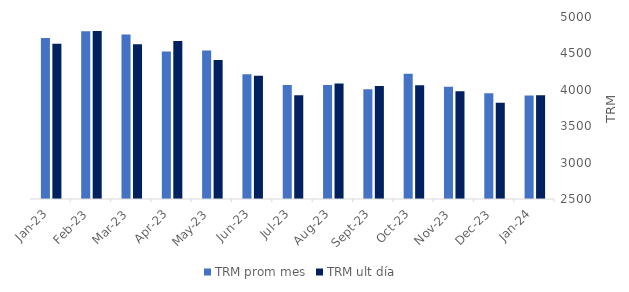
| Category | TRM prom mes | TRM ult día |
|---|---|---|
| 2023-01-01 | 4712.18 | 4632.2 |
| 2023-02-01 | 4802.75 | 4808.14 |
| 2023-03-01 | 4760.96 | 4627.27 |
| 2023-04-01 | 4526.03 | 4669 |
| 2023-05-01 | 4539.54 | 4408.65 |
| 2023-06-01 | 4213.53 | 4191.28 |
| 2023-07-01 | 4067.63 | 3923.49 |
| 2023-08-01 | 4066.87 | 4085.33 |
| 2023-09-01 | 4008.41 | 4053.76 |
| 2023-10-01 | 4219.16 | 4060.83 |
| 2023-11-01 | 4040.26 | 3980.67 |
| 2023-12-01 | 3954.14 | 3822.05 |
| 2024-01-01 | 3920.2 | 3925.6 |